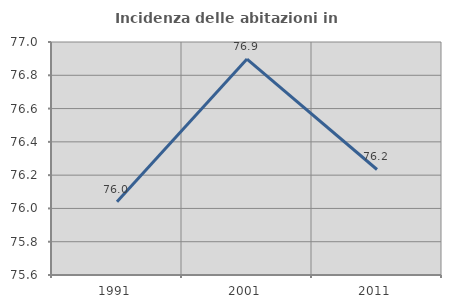
| Category | Incidenza delle abitazioni in proprietà  |
|---|---|
| 1991.0 | 76.04 |
| 2001.0 | 76.897 |
| 2011.0 | 76.234 |